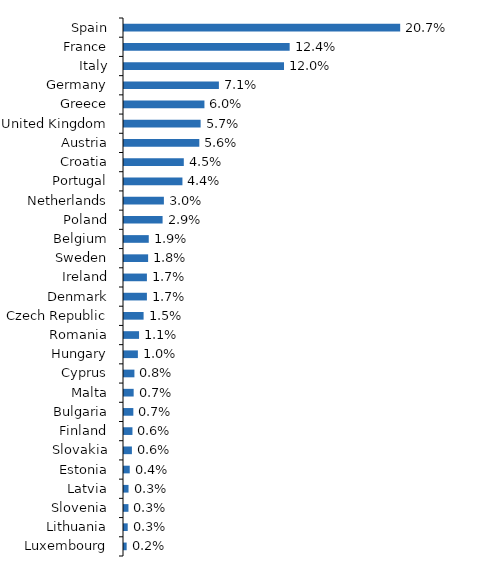
| Category | Series 0 |
|---|---|
| Spain | 0.207 |
| France | 0.124 |
| Italy | 0.12 |
| Germany | 0.071 |
| Greece | 0.06 |
| United Kingdom | 0.057 |
| Austria | 0.056 |
| Croatia | 0.045 |
| Portugal | 0.044 |
| Netherlands | 0.03 |
| Poland | 0.029 |
| Belgium | 0.019 |
| Sweden | 0.018 |
| Ireland | 0.017 |
| Denmark | 0.017 |
| Czech Republic | 0.015 |
| Romania | 0.011 |
| Hungary | 0.01 |
| Cyprus | 0.008 |
| Malta | 0.007 |
| Bulgaria | 0.007 |
| Finland | 0.006 |
| Slovakia | 0.006 |
| Estonia | 0.004 |
| Latvia | 0.003 |
| Slovenia | 0.003 |
| Lithuania | 0.003 |
| Luxembourg | 0.002 |